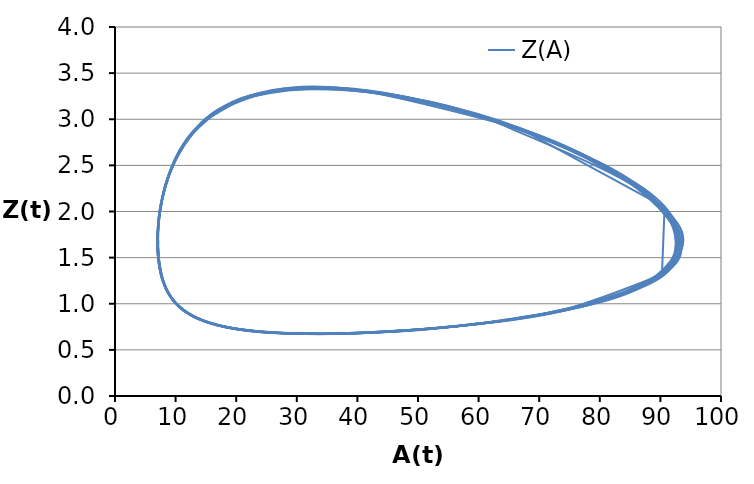
| Category | Z(A) |
|---|---|
| 10.0 | 1 |
| 13.228301938441525 | 0.849 |
| 18.360580069108593 | 0.743 |
| 26.29189283677061 | 0.683 |
| 38.14704556059735 | 0.675 |
| 54.787339665851235 | 0.743 |
| 75.05449792153178 | 0.941 |
| 91.66559064277708 | 1.378 |
| 89.22948577918501 | 2.149 |
| 63.08586612627329 | 2.991 |
| 35.195950731030315 | 3.349 |
| 19.141991159519197 | 3.175 |
| 11.707185685909886 | 2.765 |
| 8.436187698636845 | 2.318 |
| 7.141695901863062 | 1.912 |
| 6.959182365867408 | 1.569 |
| 7.619719724670802 | 1.29 |
| 9.161029300515116 | 1.069 |
| 11.847142118579834 | 0.9 |
| 16.179511383579708 | 0.778 |
| 22.940943017867525 | 0.7 |
| 33.19235804127146 | 0.672 |
| 48.00234515542841 | 0.707 |
| 67.30428944062362 | 0.847 |
| 86.70935668257032 | 1.179 |
| 93.24556000815402 | 1.826 |
| 74.48641152601729 | 2.707 |
| 44.396326603654245 | 3.289 |
| 23.839969358128556 | 3.282 |
| 13.827580451940907 | 2.929 |
| 9.361908299099758 | 2.482 |
| 7.477883447914329 | 2.057 |
| 6.933528463434061 | 1.69 |
| 7.288679539951583 | 1.387 |
| 8.483470375368393 | 1.146 |
| 10.699619780732252 | 0.958 |
| 14.345572384691913 | 0.819 |
| 20.09439360775082 | 0.724 |
| 28.912303999845633 | 0.677 |
| 41.929726473285115 | 0.685 |
| 59.731490010648876 | 0.779 |
| 80.07374174014345 | 1.026 |
| 93.38007934279611 | 1.545 |
| 84.1419066278193 | 2.38 |
| 55.11660062012504 | 3.14 |
| 29.9905581263996 | 3.341 |
| 16.673388530236352 | 3.079 |
| 10.623058537950364 | 2.648 |
| 7.990438914610735 | 2.209 |
| 7.028855418664934 | 1.818 |
| 7.072831756311342 | 1.492 |
| 7.947786026917853 | 1.229 |
| 9.752142364059234 | 1.022 |
| 12.807683451459079 | 0.865 |
| 17.683826969571058 | 0.755 |
| 25.239328034120852 | 0.689 |
| 36.57974974722243 | 0.675 |
| 52.64088261944969 | 0.732 |
| 72.64095629386779 | 0.911 |
| 90.25481157570795 | 1.314 |
| 90.69492677024837 | 2.048 |
| 66.5476452784397 | 2.908 |
| 37.8122800798893 | 3.335 |
| 20.468152332626182 | 3.208 |
| 12.321933812955706 | 2.813 |
| 8.718599185747909 | 2.366 |
| 7.256442652818774 | 1.955 |
| 6.968661814025771 | 1.605 |
| 7.538954017745498 | 1.319 |
| 8.976958245795927 | 1.092 |
| 11.52209594481685 | 0.918 |
| 15.64743176999032 | 0.791 |
| 22.102092150920747 | 0.708 |
| 31.918486264916943 | 0.674 |
| 46.18785289409597 | 0.701 |
| 65.05745247474528 | 0.827 |
| 84.82293922305635 | 1.132 |
| 93.48608611643579 | 1.742 |
| 77.36595703890436 | 2.614 |
| 47.314905810917125 | 3.251 |
| 25.47216181959911 | 3.3 |
| 14.59657448665931 | 2.971 |
| 9.718140359009494 | 2.528 |
| 7.635293658330703 | 2.099 |
| 6.97748753194801 | 1.725 |
| 7.24651756956589 | 1.417 |
| 8.35193122604888 | 1.169 |
| 10.452295863974758 | 0.976 |
| 13.931290069639495 | 0.832 |
| 19.4320182869045 | 0.733 |
| 27.88973729533604 | 0.681 |
| 40.42929184065882 | 0.683 |
| 57.74476629710723 | 0.766 |
| 78.03633113010753 | 0.993 |
| 92.6609176441317 | 1.479 |
| 86.0857219692004 | 2.289 |
| 58.10896376444275 | 3.082 |
| 31.943551022251356 | 3.342 |
| 17.62720592005219 | 3.113 |
| 11.066622404240862 | 2.691 |
| 8.194130181230534 | 2.249 |
| 7.105889398834296 | 1.854 |
| 7.064259619059898 | 1.522 |
| 7.859756315962296 | 1.253 |
| 9.568009504567037 | 1.041 |
| 12.48891837486843 | 0.88 |
| 17.165850610882828 | 0.765 |
| 24.427776087856326 | 0.695 |
| 35.36092673848286 | 0.675 |
| 50.947038891378014 | 0.725 |
| 70.67009698637645 | 0.889 |
| 88.93082305310915 | 1.266 |
| 91.57654496798487 | 1.968 |
| 69.27948759330546 | 2.836 |
| 40.04829950331861 | 3.317 |
| 21.635628403775453 | 3.231 |
| 12.869174120612032 | 2.851 |
| 8.97386920720787 | 2.405 |
| 7.366311360728219 | 1.989 |
| 6.989967228277892 | 1.634 |
| 7.487280703976012 | 1.343 |
| 8.844295733287932 | 1.111 |
| 11.280613166231657 | 0.933 |
| 15.246863075619526 | 0.801 |
| 21.465276702299207 | 0.715 |
| 30.943670397684247 | 0.676 |
| 44.783248555744905 | 0.697 |
| 63.27720935379775 | 0.813 |
| 83.21999808738165 | 1.098 |
| 93.4207915773616 | 1.677 |
| 79.49593999838352 | 2.538 |
| 49.71324968293142 | 3.215 |
| 26.871165642819015 | 3.311 |
| 15.26594076522479 | 3.002 |
| 10.032076974995636 | 2.564 |
| 7.778920598293152 | 2.132 |
| 7.026115850661855 | 1.754 |
| 7.225625484101477 | 1.44 |
| 8.261369540066415 | 1.188 |
| 10.273308419026431 | 0.991 |
| 13.625759895300552 | 0.844 |
| 18.938414185258182 | 0.741 |
| 27.1213863506578 | 0.685 |
| 39.29068615631376 | 0.682 |
| 56.2112284376743 | 0.758 |
| 76.39621625866182 | 0.97 |
| 91.91380272656205 | 1.43 |
| 87.3954003567174 | 2.218 |
| 60.45459126790872 | 3.031 |
| 33.564595876840045 | 3.338 |
| 18.436490270526832 | 3.137 |
| 11.447666871353565 | 2.723 |
| 8.373336819403201 | 2.281 |
| 7.180120516936177 | 1.881 |
| 7.069728116734375 | 1.545 |
| 7.803713058156688 | 1.272 |
| 9.439460180028103 | 1.056 |
| 12.259938659711999 | 0.891 |
| 16.788554807354828 | 0.773 |
| 23.8309985933991 | 0.7 |
| 34.4562205593418 | 0.676 |
| 49.67258767141384 | 0.72 |
| 69.14501849642963 | 0.874 |
| 87.79955214015791 | 1.231 |
| 92.04599459343665 | 1.908 |
| 71.30271546030288 | 2.778 |
| 41.833684883228635 | 3.299 |
| 22.597010294748188 | 3.246 |
| 13.326521620637598 | 2.879 |
| 9.19128495443945 | 2.434 |
| 7.465165858873375 | 2.016 |
| 7.018366268201404 | 1.657 |
| 7.459692643505424 | 1.362 |
| 8.756463739603529 | 1.126 |
| 11.113116341834067 | 0.944 |
| 14.963423361022421 | 0.81 |
| 21.009237990163506 | 0.721 |
| 30.238585988770794 | 0.679 |
| 43.75511262425203 | 0.696 |
| 61.94694969599644 | 0.803 |
| 81.95461098704496 | 1.074 |
| 93.20419092544392 | 1.631 |
| 80.96292160470504 | 2.479 |
| 51.54031026261806 | 3.183 |
| 27.982679064628897 | 3.315 |
| 15.808072883759184 | 3.025 |
| 10.290841111873629 | 2.591 |
| 7.901975343641021 | 2.157 |
| 7.074779257978435 | 1.776 |
| 7.221625250234717 | 1.458 |
| 8.206409470211055 | 1.203 |
| 10.155049999481832 | 1.003 |
| 13.417619810938701 | 0.852 |
| 18.59659156096484 | 0.747 |
| 26.582967929493595 | 0.688 |
| 38.48334844320544 | 0.682 |
| 55.10538405454763 | 0.752 |
| 75.17024369967257 | 0.955 |
| 91.25074730332322 | 1.397 |
| 88.19877243576536 | 2.166 |
| 62.14174783979223 | 2.991 |